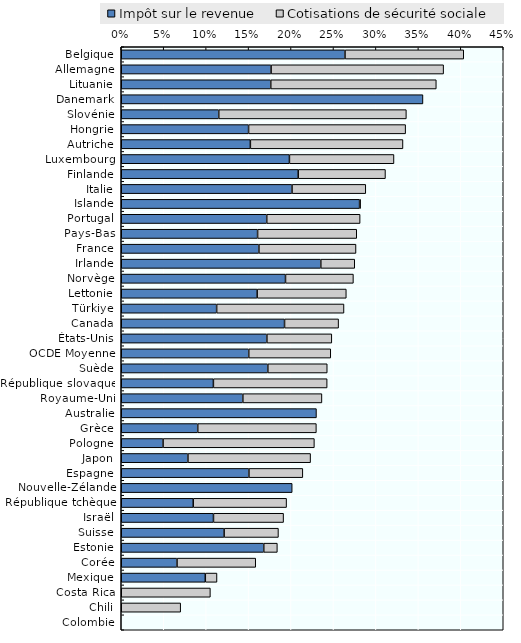
| Category | Impôt sur le revenue | Cotisations de sécurité sociale |
|---|---|---|
| Belgique | 26.359 | 13.989 |
| Allemagne | 17.65 | 20.325 |
| Lituanie | 17.613 | 19.5 |
| Danemark | 35.542 | 0 |
| Slovénie | 11.487 | 22.1 |
| Hongrie | 15 | 18.5 |
| Autriche | 15.21 | 17.977 |
| Luxembourg | 19.812 | 12.315 |
| Finlande | 20.844 | 10.28 |
| Italie | 20.116 | 8.69 |
| Islande | 28.076 | 0.121 |
| Portugal | 17.14 | 11 |
| Pays-Bas | 16.062 | 11.682 |
| France | 16.216 | 11.438 |
| Irlande | 23.507 | 4 |
| Norvège | 19.349 | 8 |
| Lettonie | 16.011 | 10.5 |
| Türkiye | 11.238 | 15 |
| Canada | 19.236 | 6.368 |
| États-Unis | 17.155 | 7.65 |
| OCDE Moyenne | 15.02 | 9.662 |
| Suède | 17.269 | 6.997 |
| République slovaque | 10.854 | 13.4 |
| Royaume-Uni | 14.325 | 9.315 |
| Australie | 22.996 | 0 |
| Grèce | 9.01 | 13.974 |
| Pologne | 4.926 | 17.826 |
| Japon | 7.854 | 14.45 |
| Espagne | 15.04 | 6.35 |
| Nouvelle-Zélande | 20.137 | 0 |
| République tchèque | 8.477 | 11 |
| Israël | 10.864 | 8.259 |
| Suisse | 12.118 | 6.4 |
| Estonie | 16.788 | 1.6 |
| Corée | 6.57 | 9.274 |
| Mexique | 9.901 | 1.378 |
| Costa Rica | 0 | 10.5 |
| Chili | 0 | 7 |
| Colombie | 0 | 0 |